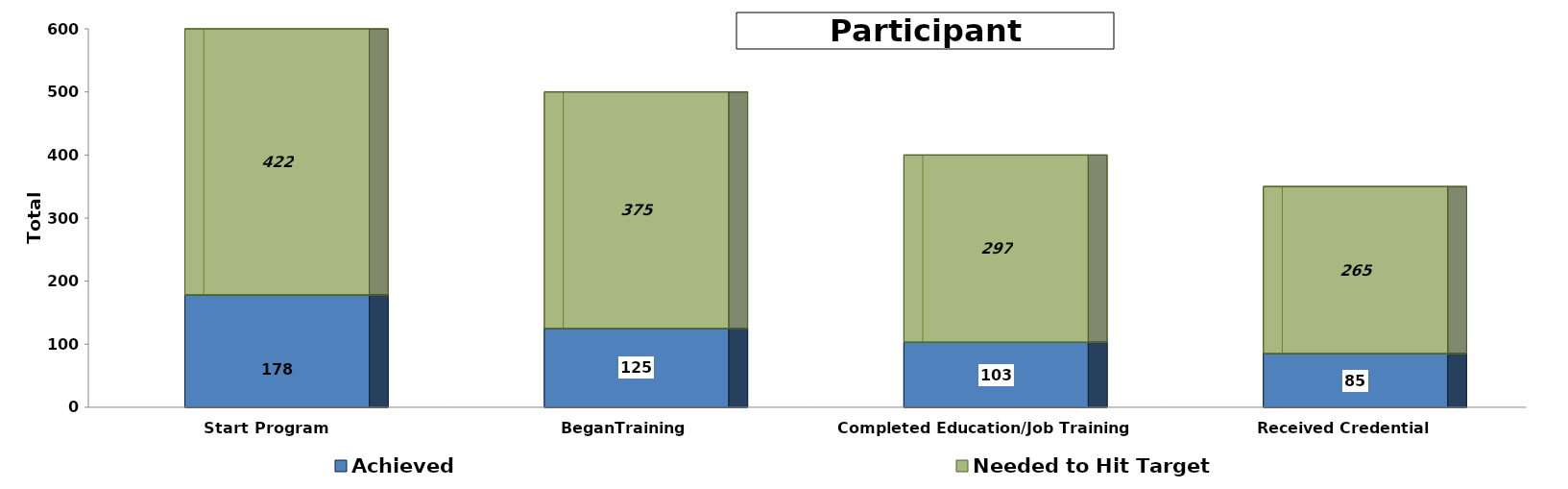
| Category | Achieved | Needed to Hit Target |
|---|---|---|
| Start Program | 178 | 422 |
| BeganTraining | 125 | 375 |
| Completed Education/Job Training | 103 | 297 |
| Received Credential | 85 | 265 |